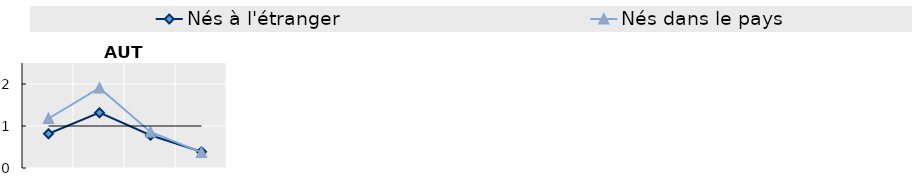
| Category | Nés à l'étranger | Nés dans le pays | Series 1 |
|---|---|---|---|
| 15-24 | 0.816 | 1.178 | 1 |
| 25-54 | 1.317 | 1.907 | 1 |
| 55-64 | 0.779 | 0.86 | 1 |
| 65+ | 0.386 | 0.371 | 1 |